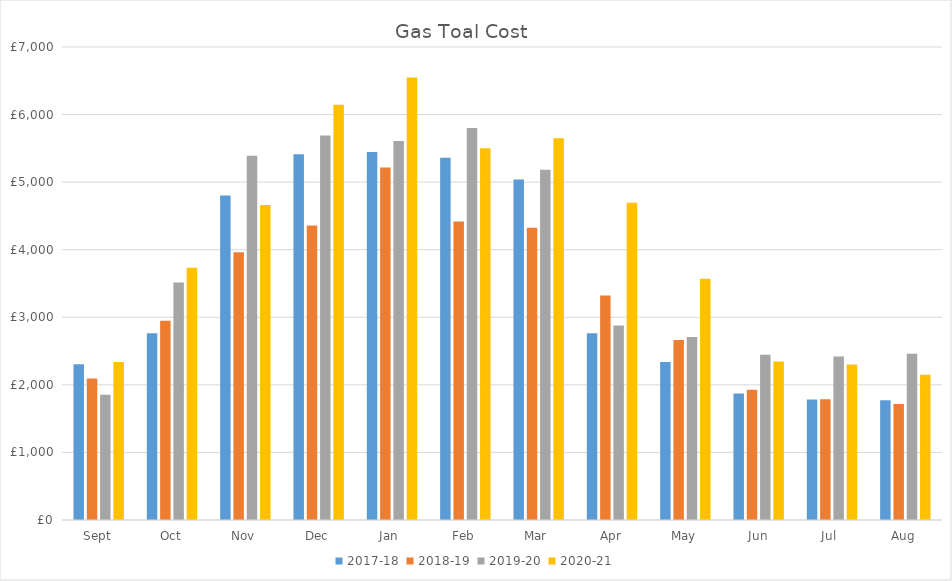
| Category | 2017-18 | 2018-19 | 2019-20 | 2020-21 |
|---|---|---|---|---|
| Sept | 2306.27 | 2094.71 | 1851.94 | 2339 |
| Oct | 2762.69 | 2949.62 | 3515 | 3734 |
| Nov | 4802.08 | 3963.58 | 5390 | 4663 |
| Dec | 5412.61 | 4359.45 | 5692 | 6144 |
| Jan  | 5446.75 | 5216.47 | 5610 | 6549 |
| Feb | 5362.58 | 4417.96 | 5801 | 5501 |
| Mar  | 5038.96 | 4323.31 | 5183 | 5649 |
| Apr | 2764.72 | 3321.98 | 2877 | 4694 |
| May | 2337.34 | 2665.35 | 2708 | 3571 |
| Jun | 1873.28 | 1925.9 | 2445 | 2345 |
| Jul  | 1784.53 | 1788.57 | 2420 | 2300 |
| Aug | 1771.16 | 1715.36 | 2461 | 2151 |